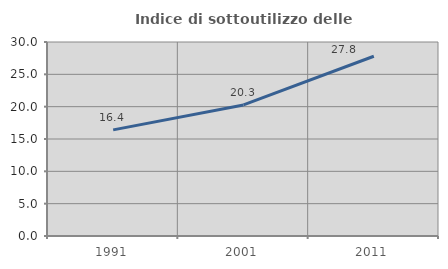
| Category | Indice di sottoutilizzo delle abitazioni  |
|---|---|
| 1991.0 | 16.411 |
| 2001.0 | 20.271 |
| 2011.0 | 27.796 |